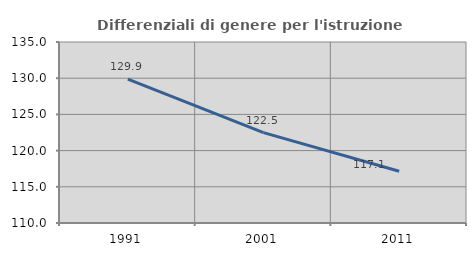
| Category | Differenziali di genere per l'istruzione superiore |
|---|---|
| 1991.0 | 129.87 |
| 2001.0 | 122.479 |
| 2011.0 | 117.14 |